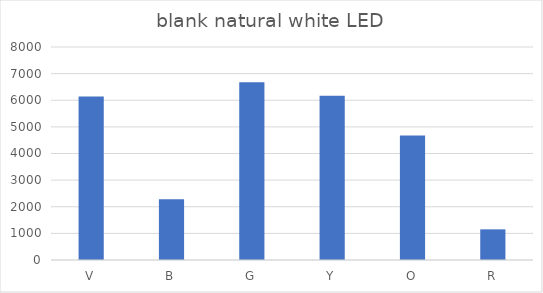
| Category | blank |
|---|---|
| V | 6140 |
| B | 2285 |
| G | 6672 |
| Y | 6166 |
| O | 4679 |
| R | 1151 |